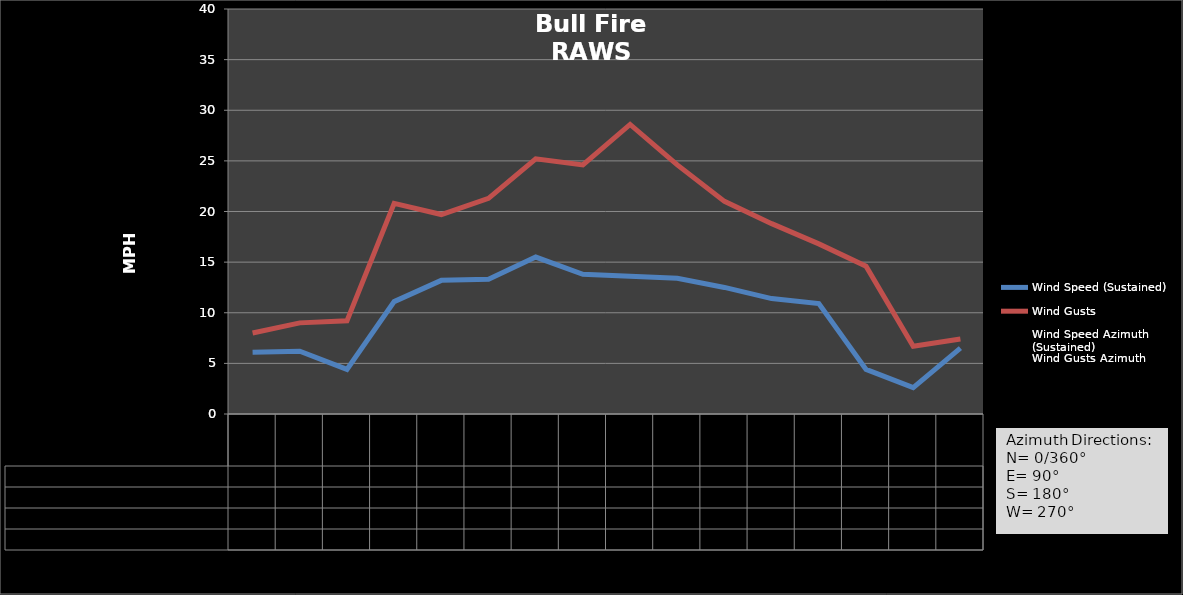
| Category | Wind Speed (Sustained) | Wind Gusts | Wind Speed Azimuth (Sustained) | Wind Gusts Azimuth |
|---|---|---|---|---|
| 2010-08-02 08:23:20 | 6.1 | 8 | 86.2 | 87.3 |
| 2010-08-02 09:23:20 | 6.2 | 9 | 99.5 | 101.9 |
| 2010-08-02 10:23:20 | 4.4 | 9.2 | 229.1 | 117 |
| 2010-08-02 11:23:20 | 11.1 | 20.8 | 268.1 | 263.5 |
| 2010-08-02 12:23:20 | 13.2 | 19.7 | 259.9 | 272.8 |
| 2010-08-02 13:23:20 | 13.3 | 21.3 | 258.3 | 240.4 |
| 2010-08-02 14:23:20 | 15.5 | 25.2 | 245 | 262.1 |
| 2010-08-02 15:23:20 | 13.8 | 24.6 | 240.5 | 235.6 |
| 2010-08-02 16:23:20 | 13.6 | 28.6 | 247.9 | 237.5 |
| 2010-08-02 17:23:20 | 13.4 | 24.6 | 251.4 | 231.8 |
| 2010-08-02 18:23:20 | 12.5 | 21 | 273.1 | 256.6 |
| 2010-08-02 19:23:20 | 11.4 | 18.8 | 265.4 | 245.2 |
| 2010-08-02 20:23:20 | 10.9 | 16.8 | 269.9 | 264.4 |
| 2010-08-02 21:23:20 | 4.4 | 14.6 | 169.5 | 291 |
| 2010-08-02 22:23:20 | 2.6 | 6.7 | 186.6 | 115.1 |
| 2010-08-02 23:23:20 | 6.5 | 7.4 | 69.6 | 76.6 |